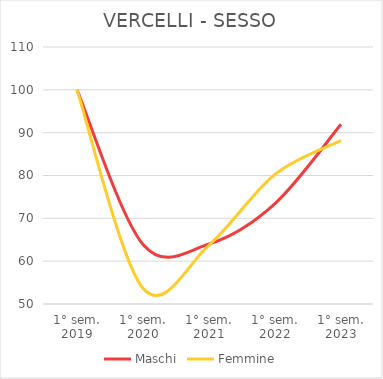
| Category | Maschi | Femmine |
|---|---|---|
| 1° sem.
2019 | 100 | 100 |
| 1° sem.
2020 | 63.912 | 53.67 |
| 1° sem.
2021 | 64.028 | 63.761 |
| 1° sem.
2022 | 73.458 | 80.275 |
| 1° sem.
2023 | 91.967 | 88.165 |